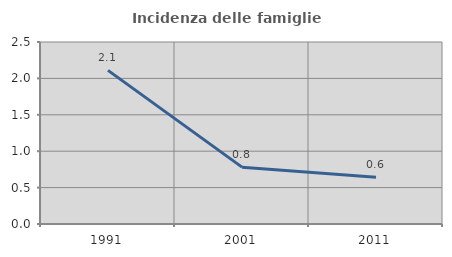
| Category | Incidenza delle famiglie numerose |
|---|---|
| 1991.0 | 2.11 |
| 2001.0 | 0.781 |
| 2011.0 | 0.641 |